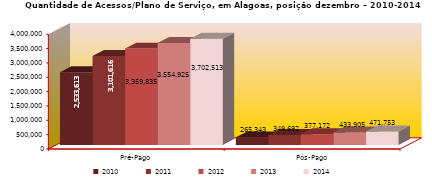
| Category | 2010 | 2011 | 2012 | 2013 | 2014 |
|---|---|---|---|---|---|
| Pré-Pago | 2533613 | 3101616 | 3359835 | 3554925 | 3702513 |
| Pós-Pago | 265343 | 349692 | 377172 | 433905 | 471753 |